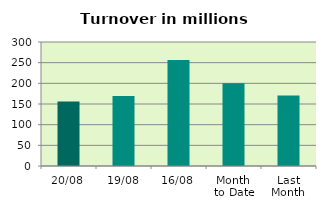
| Category | Series 0 |
|---|---|
| 20/08 | 156.131 |
| 19/08 | 169.184 |
| 16/08 | 256.445 |
| Month 
to Date | 200.329 |
| Last
Month | 170.387 |